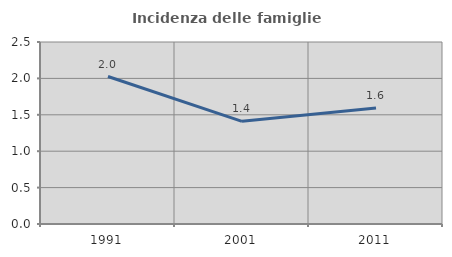
| Category | Incidenza delle famiglie numerose |
|---|---|
| 1991.0 | 2.026 |
| 2001.0 | 1.411 |
| 2011.0 | 1.594 |